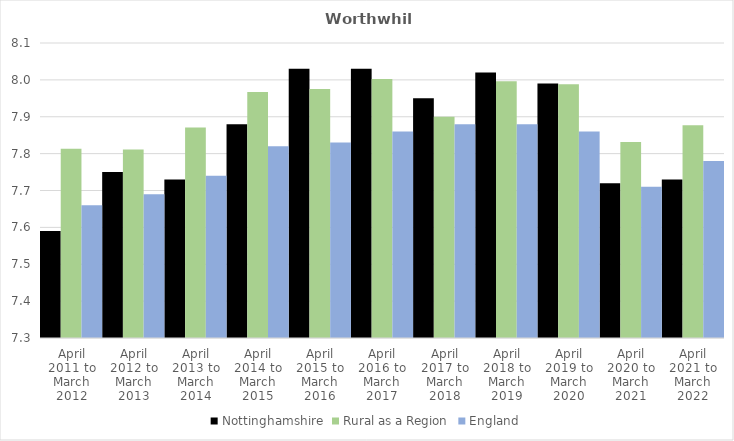
| Category | Nottinghamshire | Rural as a Region | England |
|---|---|---|---|
| April 2011 to March 2012 | 7.59 | 7.813 | 7.66 |
| April 2012 to March 2013 | 7.75 | 7.811 | 7.69 |
| April 2013 to March 2014 | 7.73 | 7.871 | 7.74 |
| April 2014 to March 2015 | 7.88 | 7.967 | 7.82 |
| April 2015 to March 2016 | 8.03 | 7.975 | 7.83 |
| April 2016 to March 2017 | 8.03 | 8.002 | 7.86 |
| April 2017 to March 2018 | 7.95 | 7.9 | 7.88 |
| April 2018 to March 2019 | 8.02 | 7.996 | 7.88 |
| April 2019 to March 2020 | 7.99 | 7.988 | 7.86 |
| April 2020 to March 2021 | 7.72 | 7.831 | 7.71 |
| April 2021 to March 2022 | 7.73 | 7.877 | 7.78 |